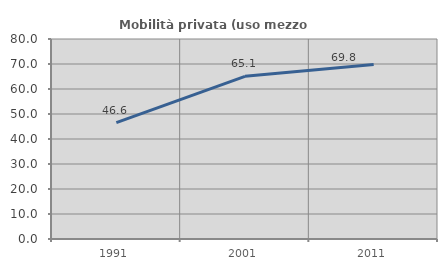
| Category | Mobilità privata (uso mezzo privato) |
|---|---|
| 1991.0 | 46.563 |
| 2001.0 | 65.083 |
| 2011.0 | 69.76 |